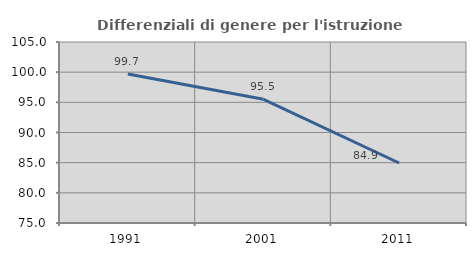
| Category | Differenziali di genere per l'istruzione superiore |
|---|---|
| 1991.0 | 99.693 |
| 2001.0 | 95.495 |
| 2011.0 | 84.946 |